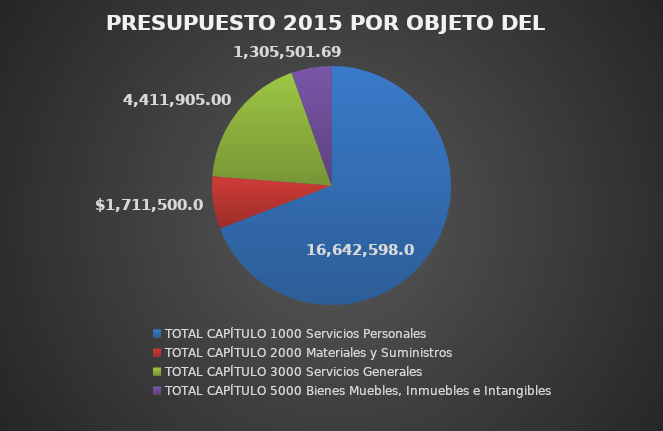
| Category | PRESUPUESTO 2015 POR OBJETO DEL GASTO |
|---|---|
| TOTAL CAPÍTULO 1000 Servicios Personales | 16642598 |
| TOTAL CAPÍTULO 2000 Materiales y Suministros | 1711500 |
| TOTAL CAPÍTULO 3000 Servicios Generales | 4411905 |
| TOTAL CAPÍTULO 5000 Bienes Muebles, Inmuebles e Intangibles | 1305501.69 |